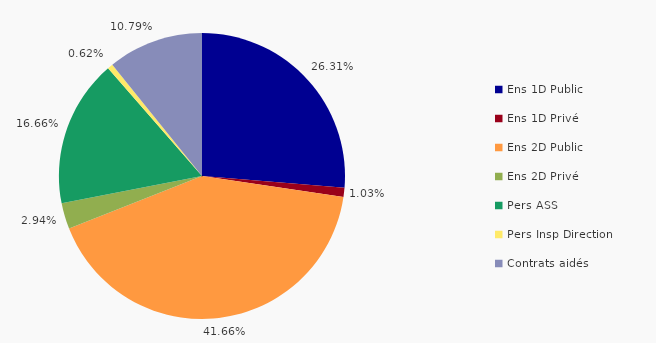
| Category | Series 0 |
|---|---|
| Ens 1D Public | 9416 |
| Ens 1D Privé | 368 |
| Ens 2D Public | 14910 |
| Ens 2D Privé | 1051 |
| Pers ASS | 5960 |
| Pers Insp Direction | 220 |
| Contrats aidés | 3862 |